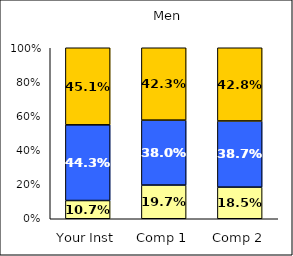
| Category | Low Social Agency | Average Social Agency | High Social Agency |
|---|---|---|---|
| Your Inst | 0.107 | 0.443 | 0.451 |
| Comp 1 | 0.197 | 0.38 | 0.423 |
| Comp 2 | 0.185 | 0.387 | 0.428 |